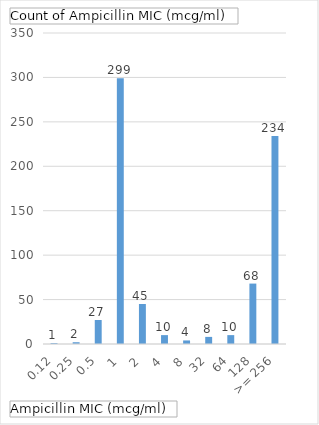
| Category | Total |
|---|---|
| 0.12 | 1 |
| 0.25 | 2 |
| 0.5 | 27 |
| 1 | 299 |
| 2 | 45 |
| 4 | 10 |
| 8 | 4 |
| 32 | 8 |
| 64 | 10 |
| 128 | 68 |
| >= 256 | 234 |